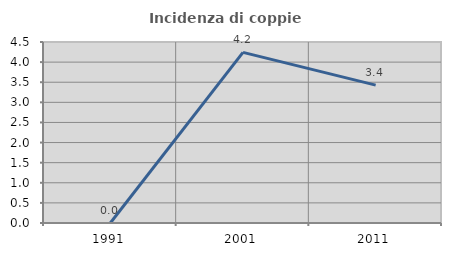
| Category | Incidenza di coppie miste |
|---|---|
| 1991.0 | 0 |
| 2001.0 | 4.242 |
| 2011.0 | 3.429 |